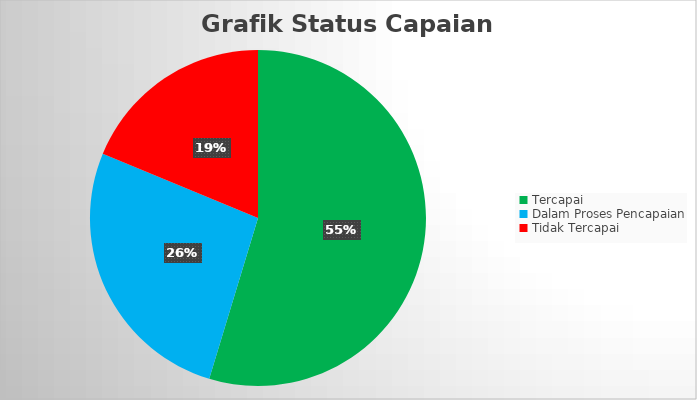
| Category | Series 0 |
|---|---|
| Tercapai | 0.547 |
| Dalam Proses Pencapaian | 0.266 |
| Tidak Tercapai | 0.188 |